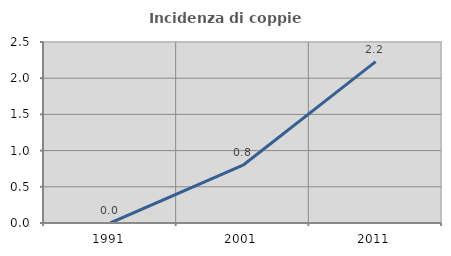
| Category | Incidenza di coppie miste |
|---|---|
| 1991.0 | 0 |
| 2001.0 | 0.798 |
| 2011.0 | 2.228 |